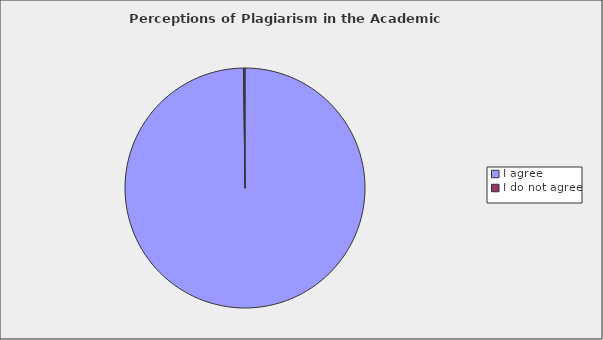
| Category | Series 0 |
|---|---|
| I agree | 0.998 |
| I do not agree | 0.002 |